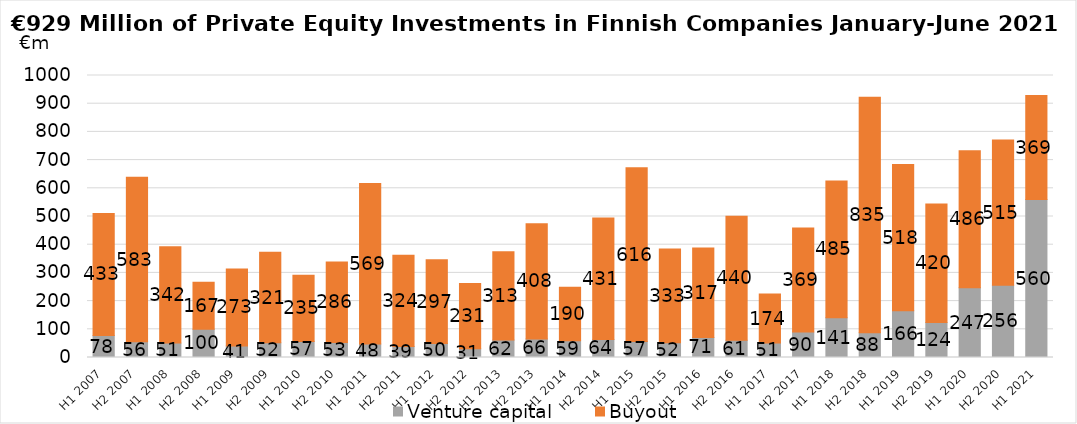
| Category | Venture capital | Buyout |
|---|---|---|
| H1 2007 | 78 | 433 |
| H2 2007 | 56 | 583 |
| H1 2008 | 51 | 342 |
| H2 2008 | 100 | 167 |
| H1 2009 | 41 | 273 |
| H2 2009 | 52 | 321 |
| H1 2010 | 57 | 235 |
| H2 2010 | 53 | 286 |
| H1 2011 | 48 | 569 |
| H2 2011 | 39 | 324 |
| H1 2012 | 50 | 297 |
| H2 2012 | 31 | 231 |
| H1 2013 | 62 | 313 |
| H2 2013 | 66 | 408 |
| H1 2014 | 59 | 190 |
| H2 2014 | 64 | 431 |
| H1 2015 | 57 | 616 |
| H2 2015 | 52 | 333 |
| H1 2016 | 71 | 317 |
| H2 2016 | 61 | 440 |
| H1 2017 | 51 | 174 |
| H2 2017 | 90 | 369 |
| H1 2018 | 141 | 485 |
| H2 2018 | 88 | 835 |
| H1 2019 | 166 | 518 |
| H2 2019 | 124 | 420 |
| H1 2020 | 247 | 486 |
| H2 2020 | 256 | 515 |
| H1 2021 | 560 | 369 |